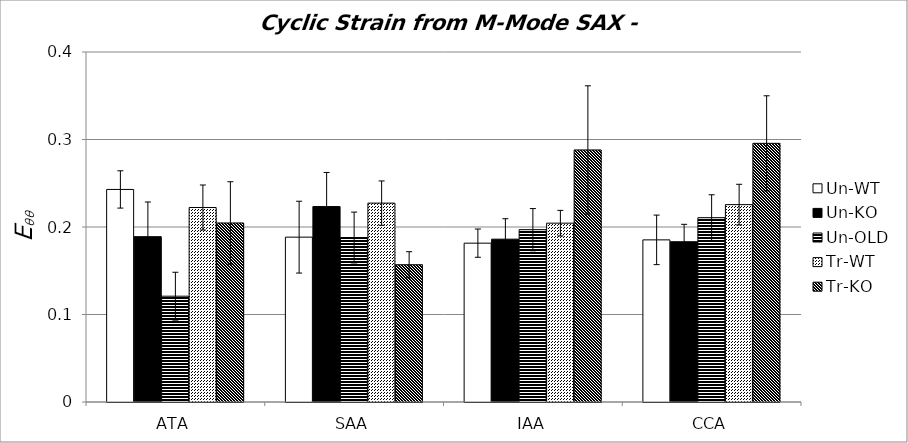
| Category | Un-WT | Un-KO | Un-OLD | Tr-WT | Tr-KO |
|---|---|---|---|---|---|
| 0 | 0.243 | 0.189 | 0.121 | 0.222 | 0.205 |
| 1 | 0.188 | 0.223 | 0.188 | 0.227 | 0.157 |
| 2 | 0.182 | 0.186 | 0.197 | 0.204 | 0.288 |
| 3 | 0.185 | 0.183 | 0.211 | 0.226 | 0.296 |